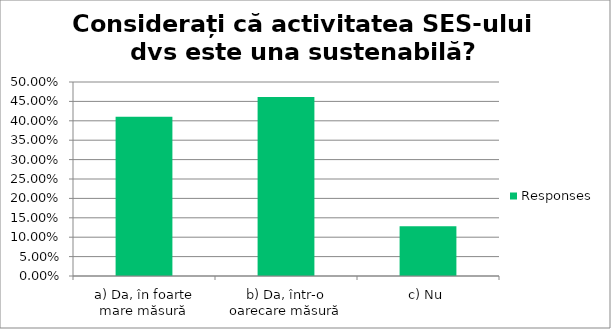
| Category | Responses |
|---|---|
| a) Da, în foarte mare măsură | 0.41 |
| b) Da, într-o oarecare măsură | 0.462 |
| c) Nu | 0.128 |